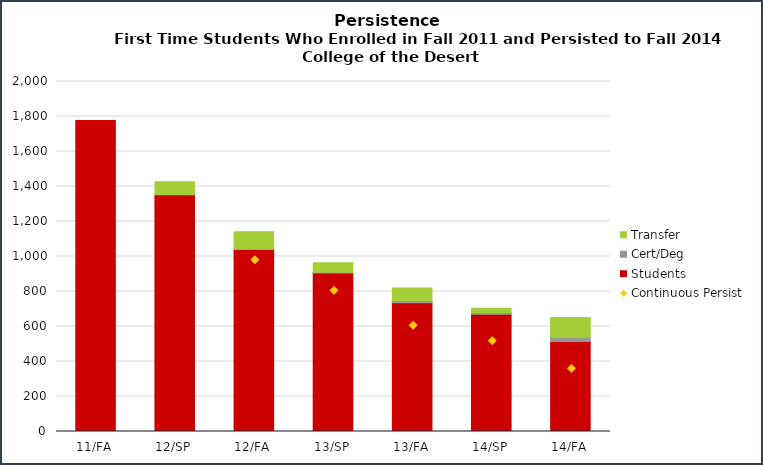
| Category | Students | Cert/Deg | Transfer |
|---|---|---|---|
| 11/FA | 1777 | 0 | 0 |
| 12/SP | 1353 | 0 | 74 |
| 12/FA | 1041 | 1 | 100 |
| 13/SP | 906 | 4 | 54 |
| 13/FA | 736 | 13 | 71 |
| 14/SP | 670 | 9 | 26 |
| 14/FA | 515 | 23 | 114 |